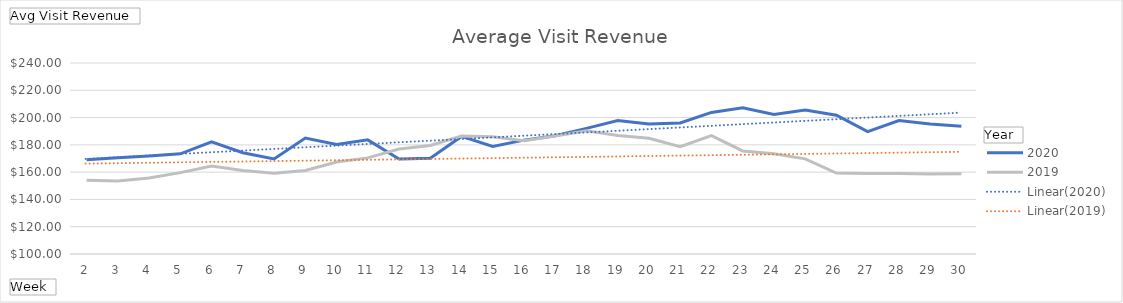
| Category | 2020 | 2019 |
|---|---|---|
| 2 | 169.097 | 154.065 |
| 3 | 170.557 | 153.568 |
| 4 | 171.841 | 155.753 |
| 5 | 173.421 | 159.654 |
| 6 | 182.25 | 164.404 |
| 7 | 174.263 | 161.137 |
| 8 | 169.646 | 159.17 |
| 9 | 184.996 | 161.226 |
| 10 | 180.301 | 167.412 |
| 11 | 183.661 | 170.443 |
| 12 | 169.641 | 176.981 |
| 13 | 170.169 | 179.591 |
| 14 | 186.2 | 186.421 |
| 15 | 178.812 | 185.961 |
| 16 | 183.452 | 183.068 |
| 17 | 186.651 | 186.564 |
| 18 | 192.101 | 190.382 |
| 19 | 197.888 | 186.836 |
| 20 | 195.291 | 184.846 |
| 21 | 196.094 | 178.734 |
| 22 | 203.77 | 186.796 |
| 23 | 207.103 | 175.529 |
| 24 | 202.197 | 173.432 |
| 25 | 205.499 | 169.735 |
| 26 | 201.734 | 159.316 |
| 27 | 189.729 | 159.071 |
| 28 | 197.808 | 159.078 |
| 29 | 195.33 | 158.552 |
| 30 | 193.673 | 158.902 |